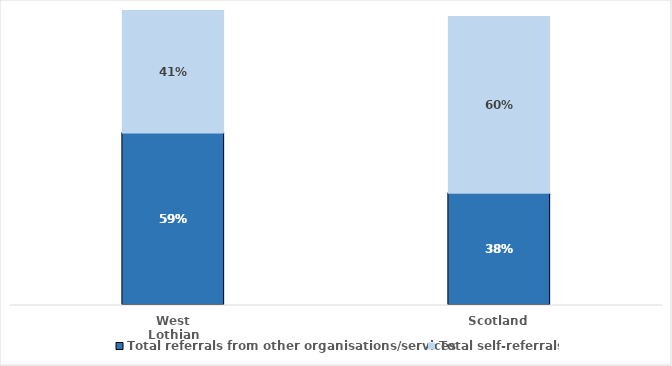
| Category | Total referrals from other organisations/services | Total self-referrals |
|---|---|---|
| West Lothian | 0.585 | 0.415 |
| Scotland | 0.381 | 0.599 |